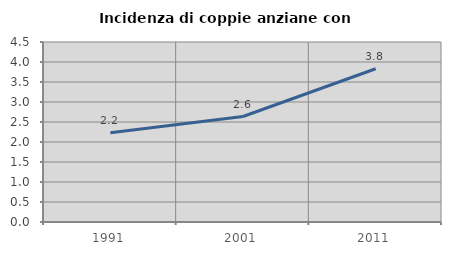
| Category | Incidenza di coppie anziane con figli |
|---|---|
| 1991.0 | 2.233 |
| 2001.0 | 2.637 |
| 2011.0 | 3.831 |